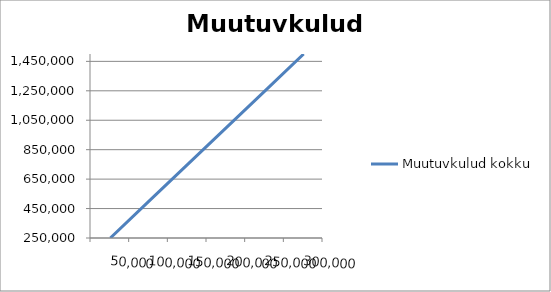
| Category | Muutuvkulud kokku |
|---|---|
| 50000.0 | 250000 |
| 100000.0 | 500000 |
| 150000.0 | 750000 |
| 200000.0 | 1000000 |
| 250000.0 | 1250000 |
| 300000.0 | 1500000 |